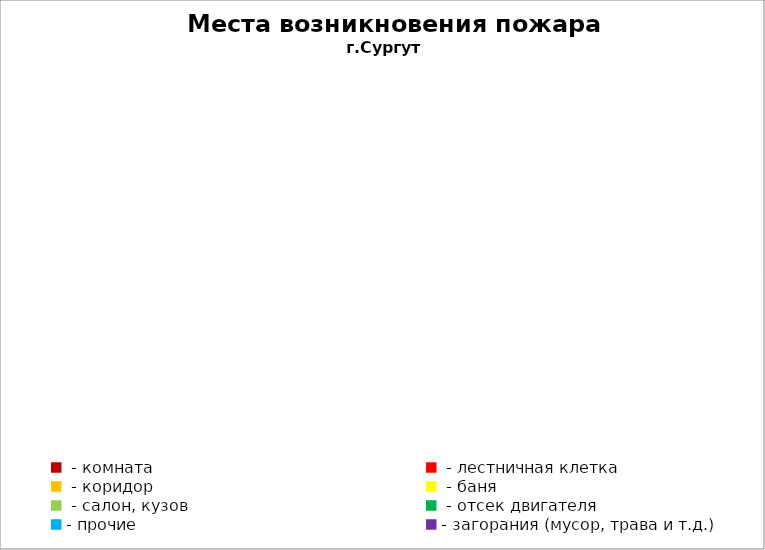
| Category | Места возникновения пожара |
|---|---|
|  - комната | 44 |
|  - лестничная клетка | 11 |
|  - коридор | 6 |
|  - баня | 17 |
|  - салон, кузов | 7 |
|  - отсек двигателя | 15 |
| - прочие | 69 |
| - загорания (мусор, трава и т.д.)  | 131 |